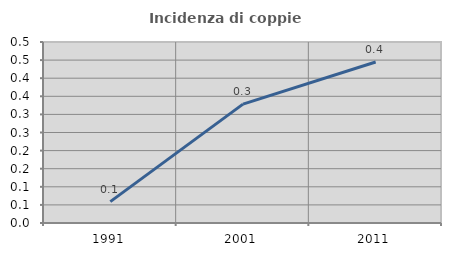
| Category | Incidenza di coppie miste |
|---|---|
| 1991.0 | 0.059 |
| 2001.0 | 0.328 |
| 2011.0 | 0.445 |